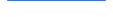
| Category | Series 0 |
|---|---|
| 0 | 182 |
| 1 | 140 |
| 2 | 154 |
| 3 | 161 |
| 4 | 151 |
| 5 | 162 |
| 6 | 176 |
| 7 | 191 |
| 8 | 181 |